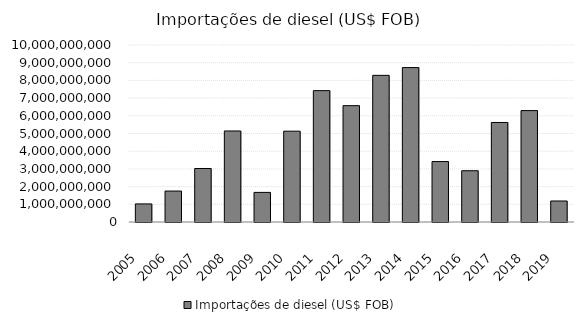
| Category | Importações de diesel (US$ FOB) |
|---|---|
| 2005.0 | 1021521919 |
| 2006.0 | 1748306202 |
| 2007.0 | 3023316293 |
| 2008.0 | 5142253134 |
| 2009.0 | 1672498470 |
| 2010.0 | 5131079360 |
| 2011.0 | 7421941848 |
| 2012.0 | 6573719918 |
| 2013.0 | 8284785484 |
| 2014.0 | 8724821352 |
| 2015.0 | 3415147205 |
| 2016.0 | 2896807394 |
| 2017.0 | 5622448833 |
| 2018.0 | 6293876522 |
| 2019.0 | 1187110098 |